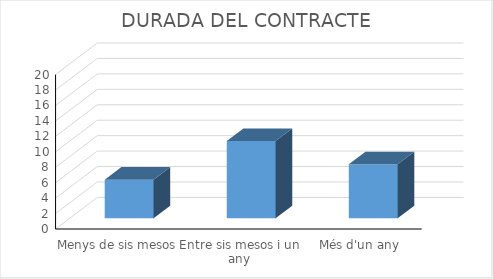
| Category | Series 0 |
|---|---|
| Menys de sis mesos | 5 |
| Entre sis mesos i un any | 10 |
| Més d'un any | 7 |